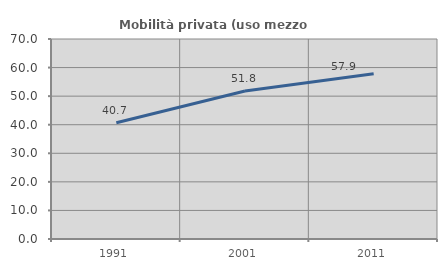
| Category | Mobilità privata (uso mezzo privato) |
|---|---|
| 1991.0 | 40.659 |
| 2001.0 | 51.795 |
| 2011.0 | 57.875 |